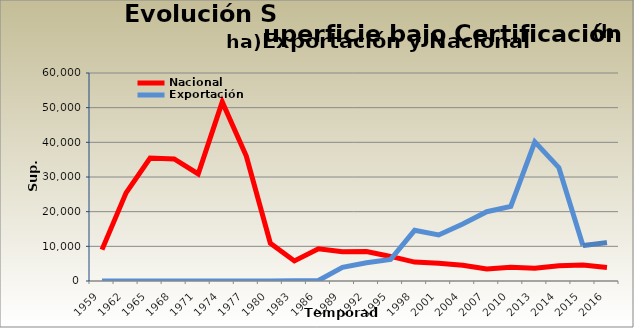
| Category | Nacional | Exportación |
|---|---|---|
| 1959.0 | 9053 | 0 |
| 1962.0 | 25417 | 0 |
| 1965.0 | 35485 | 0 |
| 1968.0 | 35216 | 0 |
| 1971.0 | 30869 | 0 |
| 1974.0 | 51638 | 0 |
| 1977.0 | 36049 | 0 |
| 1980.0 | 10916 | 0 |
| 1983.0 | 5799 | 67 |
| 1986.0 | 9313 | 134 |
| 1989.0 | 8433 | 3957 |
| 1992.0 | 8479 | 5276 |
| 1995.0 | 7087 | 6206 |
| 1998.0 | 5461 | 14621 |
| 2001.0 | 5121 | 13275 |
| 2004.0 | 4517 | 16439 |
| 2007.0 | 3448 | 19979 |
| 2010.0 | 3989 | 21512 |
| 2013.0 | 3662 | 40125 |
| 2014.0 | 4409 | 32693 |
| 2015.0 | 4636 | 10219 |
| 2016.0 | 3913.038 | 11082 |